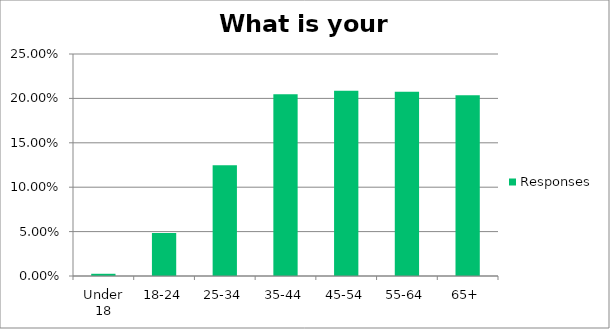
| Category | Responses |
|---|---|
| Under 18 | 0.002 |
| 18-24 | 0.048 |
| 25-34 | 0.125 |
| 35-44 | 0.205 |
| 45-54 | 0.209 |
| 55-64 | 0.207 |
| 65+ | 0.204 |